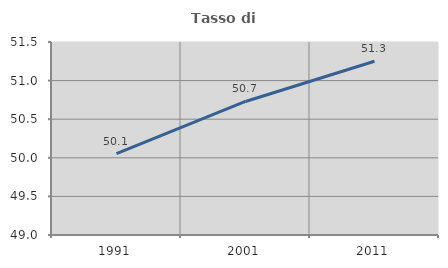
| Category | Tasso di occupazione   |
|---|---|
| 1991.0 | 50.053 |
| 2001.0 | 50.73 |
| 2011.0 | 51.251 |